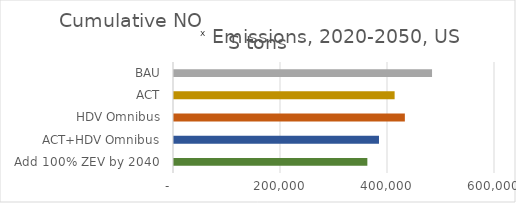
| Category | Cumulative NOx Emissions, 2020-2050, US tons |
|---|---|
|  Add 100% ZEV by 2040  | 361410.076 |
| ACT+HDV Omnibus | 383150 |
| HDV Omnibus | 431510 |
| ACT | 412380 |
| BAU | 482330 |